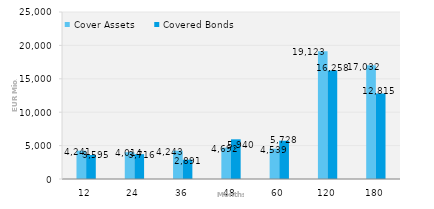
| Category | Cover Assets | Covered Bonds |
|---|---|---|
| 12.0 | 4240.879 | 3594.688 |
| 24.0 | 4013.755 | 3716 |
| 36.0 | 4242.751 | 2890.872 |
| 48.0 | 4691.732 | 5939.957 |
| 60.0 | 4539.381 | 5728.067 |
| 120.0 | 19123.241 | 16258.384 |
| 180.0 | 17031.736 | 12815.448 |